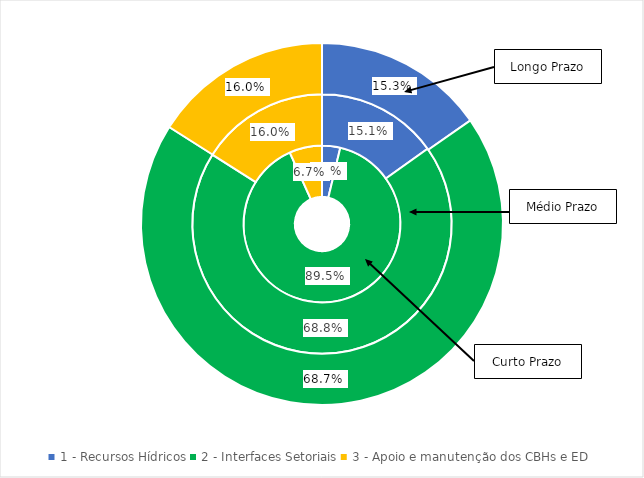
| Category | Curto Prazo (%) | Médio Prazo (%) | Longo Prazo (%) |
|---|---|---|---|
| 1 - Recursos Hídricos | 0.038 | 0.151 | 0.153 |
| 2 - Interfaces Setoriais | 0.895 | 0.688 | 0.687 |
| 3 - Apoio e manutenção dos CBHs e ED | 0.067 | 0.16 | 0.16 |